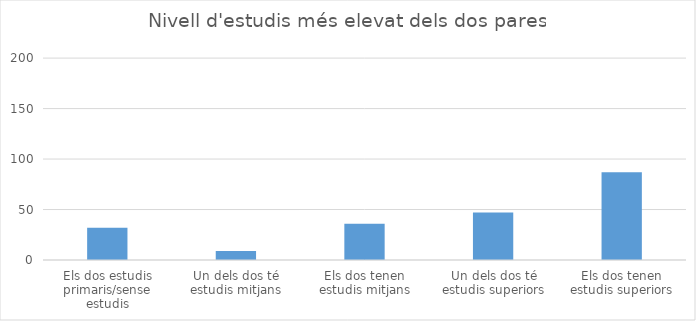
| Category | Series 0 |
|---|---|
| Els dos estudis primaris/sense estudis | 32 |
| Un dels dos té estudis mitjans | 9 |
| Els dos tenen estudis mitjans | 36 |
| Un dels dos té estudis superiors | 47 |
| Els dos tenen estudis superiors | 87 |